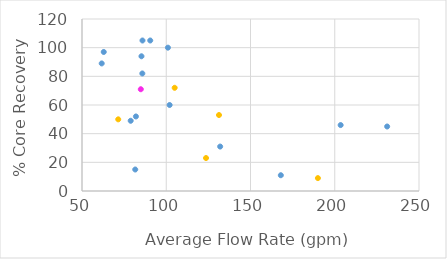
| Category | Recovery vs Average Measured Flow Rate |
|---|---|
| 123.6 | 23 |
| 131.3 | 53 |
| 168.0 | 11 |
| 231.1 | 45 |
| 132.0 | 31 |
| 82.0 | 52 |
| 81.6 | 15 |
| 203.5 | 46 |
| 84.9 | 71 |
| 78.9 | 49 |
| 101.0 | 100 |
| 85.9 | 105 |
| 62.9 | 97 |
| 85.3 | 94 |
| 90.5 | 105 |
| 85.8 | 82 |
| 61.7 | 89 |
| 71.5 | 50 |
| 190.0 | 9 |
| 102.0 | 60 |
| 105.0 | 72 |